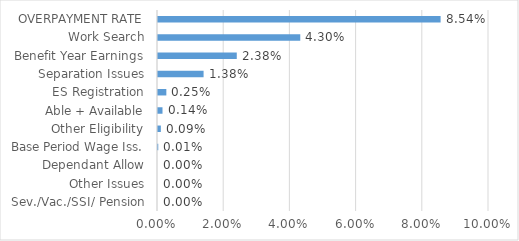
| Category | Series 0 |
|---|---|
| Sev./Vac./SSI/ Pension | 0 |
| Other Issues | 0 |
| Dependant Allow | 0 |
| Base Period Wage Iss. | 0 |
| Other Eligibility | 0.001 |
| Able + Available | 0.001 |
| ES Registration | 0.003 |
| Separation Issues | 0.014 |
| Benefit Year Earnings | 0.024 |
| Work Search | 0.043 |
| OVERPAYMENT RATE | 0.085 |